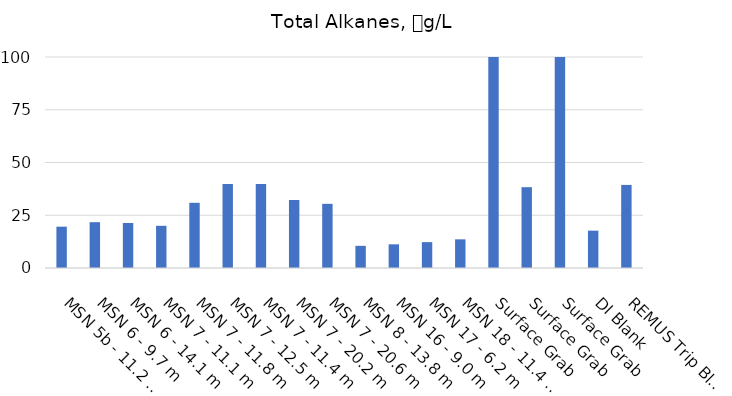
| Category | Total Alkanes |
|---|---|
| MSN 5b - 11.2 m | 19.587 |
| MSN 6 - 9.7 m | 21.707 |
| MSN 6 - 14.1 m | 21.319 |
| MSN 7 - 11.1 m | 19.997 |
| MSN 7 - 11.8 m | 30.901 |
| MSN 7 - 12.5 m | 39.825 |
| MSN 7 - 11.4 m | 39.82 |
| MSN 7 - 20.2 m | 32.221 |
| MSN 7 - 20.6 m | 30.414 |
| MSN 8 - 13.8 m | 10.499 |
| MSN 16 - 9.0 m | 11.223 |
| MSN 17 - 6.2 m | 12.261 |
| MSN 18 - 11.4 m | 13.585 |
| Surface Grab | 1246.584 |
| Surface Grab | 38.304 |
| Surface Grab | 964.394 |
| DI Blank | 17.695 |
| REMUS Trip Blank | 39.373 |